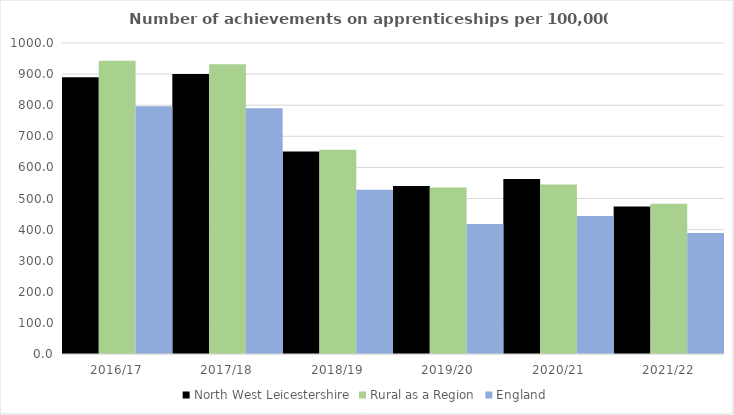
| Category | North West Leicestershire | Rural as a Region | England |
|---|---|---|---|
| 2016/17 | 890 | 942.594 | 797 |
| 2017/18 | 900 | 931.709 | 790 |
| 2018/19 | 651 | 656.44 | 528 |
| 2019/20 | 540 | 535.552 | 418 |
| 2020/21 | 563 | 545.333 | 444 |
| 2021/22 | 474 | 482.936 | 389 |